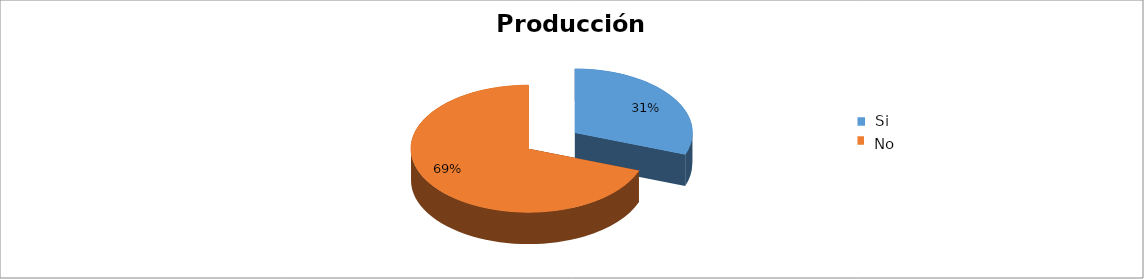
| Category | Series 0 |
|---|---|
| 0 | 0.306 |
| 1 | 0.694 |